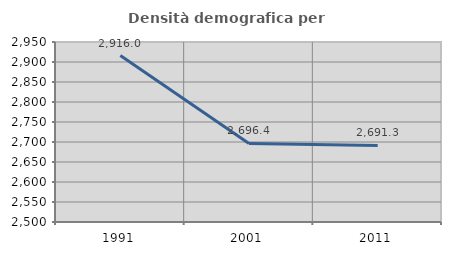
| Category | Densità demografica |
|---|---|
| 1991.0 | 2916.01 |
| 2001.0 | 2696.425 |
| 2011.0 | 2691.322 |